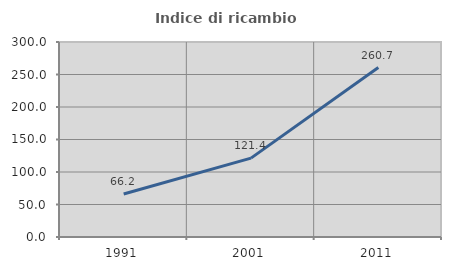
| Category | Indice di ricambio occupazionale  |
|---|---|
| 1991.0 | 66.192 |
| 2001.0 | 121.364 |
| 2011.0 | 260.684 |